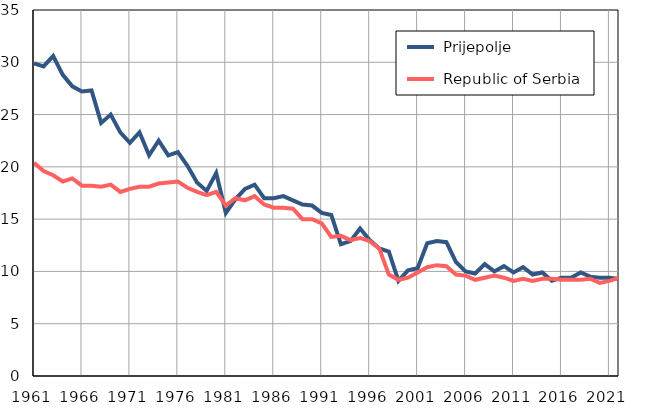
| Category |  Prijepolje |  Republic of Serbia |
|---|---|---|
| 1961.0 | 29.9 | 20.4 |
| 1962.0 | 29.6 | 19.6 |
| 1963.0 | 30.6 | 19.2 |
| 1964.0 | 28.8 | 18.6 |
| 1965.0 | 27.7 | 18.9 |
| 1966.0 | 27.2 | 18.2 |
| 1967.0 | 27.3 | 18.2 |
| 1968.0 | 24.2 | 18.1 |
| 1969.0 | 25 | 18.3 |
| 1970.0 | 23.3 | 17.6 |
| 1971.0 | 22.3 | 17.9 |
| 1972.0 | 23.3 | 18.1 |
| 1973.0 | 21.1 | 18.1 |
| 1974.0 | 22.5 | 18.4 |
| 1975.0 | 21.1 | 18.5 |
| 1976.0 | 21.4 | 18.6 |
| 1977.0 | 20.1 | 18 |
| 1978.0 | 18.5 | 17.6 |
| 1979.0 | 17.7 | 17.3 |
| 1980.0 | 19.4 | 17.6 |
| 1981.0 | 15.6 | 16.3 |
| 1982.0 | 16.9 | 17 |
| 1983.0 | 17.9 | 16.8 |
| 1984.0 | 18.3 | 17.2 |
| 1985.0 | 17 | 16.4 |
| 1986.0 | 17 | 16.1 |
| 1987.0 | 17.2 | 16.1 |
| 1988.0 | 16.8 | 16 |
| 1989.0 | 16.4 | 15 |
| 1990.0 | 16.3 | 15 |
| 1991.0 | 15.6 | 14.6 |
| 1992.0 | 15.4 | 13.3 |
| 1993.0 | 12.6 | 13.4 |
| 1994.0 | 12.9 | 13 |
| 1995.0 | 14.1 | 13.2 |
| 1996.0 | 13 | 12.9 |
| 1997.0 | 12.2 | 12.2 |
| 1998.0 | 11.9 | 9.7 |
| 1999.0 | 9.1 | 9.2 |
| 2000.0 | 10.1 | 9.4 |
| 2001.0 | 10.3 | 9.9 |
| 2002.0 | 12.7 | 10.4 |
| 2003.0 | 12.9 | 10.6 |
| 2004.0 | 12.8 | 10.5 |
| 2005.0 | 10.9 | 9.7 |
| 2006.0 | 10 | 9.6 |
| 2007.0 | 9.8 | 9.2 |
| 2008.0 | 10.7 | 9.4 |
| 2009.0 | 10 | 9.6 |
| 2010.0 | 10.5 | 9.4 |
| 2011.0 | 9.9 | 9.1 |
| 2012.0 | 10.4 | 9.3 |
| 2013.0 | 9.7 | 9.1 |
| 2014.0 | 9.9 | 9.3 |
| 2015.0 | 9.1 | 9.3 |
| 2016.0 | 9.4 | 9.2 |
| 2017.0 | 9.4 | 9.2 |
| 2018.0 | 9.9 | 9.2 |
| 2019.0 | 9.5 | 9.3 |
| 2020.0 | 9.4 | 8.9 |
| 2021.0 | 9.4 | 9.1 |
| 2022.0 | 9.3 | 9.4 |